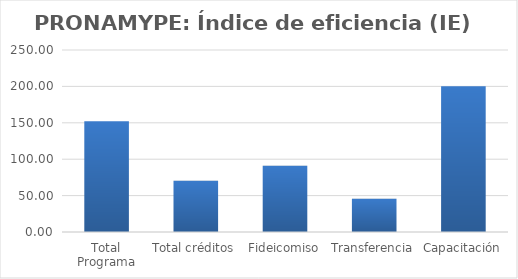
| Category | Índice de eficiencia (IE)  |
|---|---|
| Total Programa | 152.156 |
| Total créditos | 70.231 |
| Fideicomiso | 91.089 |
| Transferencia | 45.618 |
| Capacitación | 200.332 |